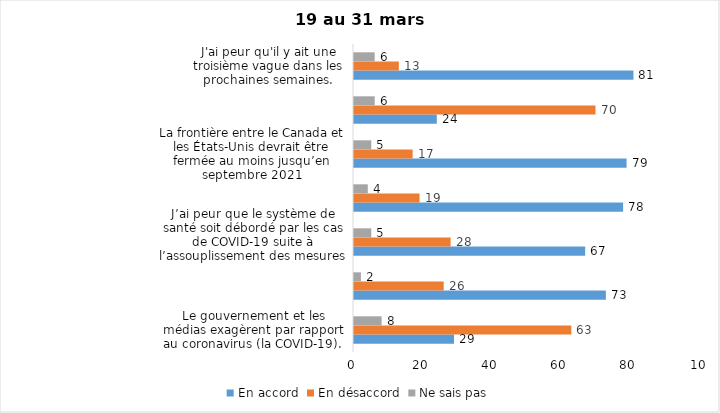
| Category | En accord | En désaccord | Ne sais pas |
|---|---|---|---|
| Le gouvernement et les médias exagèrent par rapport au coronavirus (la COVID-19). | 29 | 63 | 8 |
| Je suis favorable au maintien du couvre-feu pour les prochaines semaines. | 73 | 26 | 2 |
| J’ai peur que le système de santé soit débordé par les cas de COVID-19 suite à l’assouplissement des mesures | 67 | 28 | 5 |
| Je suis inquiet/inquiète  que le nombre de cas augmente en raison des nouveaux variants du virus de la COVID-19 | 78 | 19 | 4 |
| La frontière entre le Canada et les États-Unis devrait être fermée au moins jusqu’en septembre 2021 | 79 | 17 | 5 |
| Les personnes vaccinées contre la COVID-19 devraient avoir le droit de faire des rassemblements privés et de ne plus porter le masque dans les lieux publics. | 24 | 70 | 6 |
| J'ai peur qu'il y ait une troisième vague dans les prochaines semaines. | 81 | 13 | 6 |